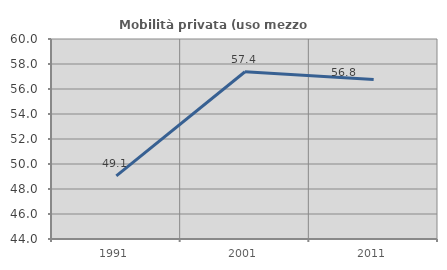
| Category | Mobilità privata (uso mezzo privato) |
|---|---|
| 1991.0 | 49.056 |
| 2001.0 | 57.38 |
| 2011.0 | 56.757 |